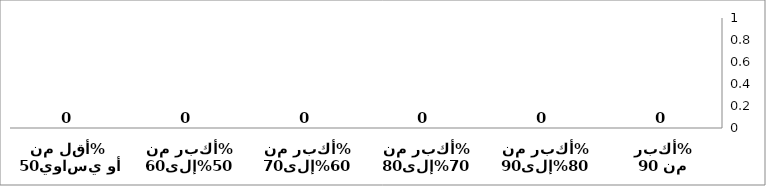
| Category | Series 0 | Series 1 | Series 2 |
|---|---|---|---|
| أكبر من 90% | 0 |  |  |
| أكبر من 80%إلى90% | 0 |  |  |
| أكبر من 70%إلى80% | 0 |  |  |
| أكبر من 60%إلى70% | 0 |  |  |
| أكبر من 50%إلى60% | 0 |  |  |
| أقل من أو يساوي50%  | 0 |  |  |